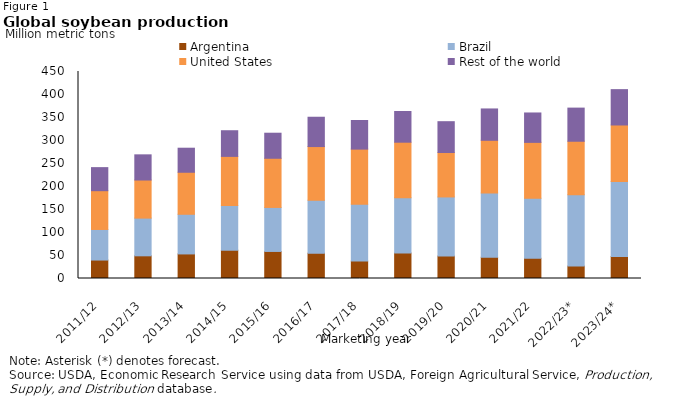
| Category | Argentina                      | Brazil                         | United States                  | Rest of the world |
|---|---|---|---|---|
| 2011/12 | 40.1 | 66.5 | 84.291 | 50.134 |
| 2012/13 | 49.3 | 82 | 82.791 | 54.732 |
| 2013/14 | 53.4 | 86.2 | 91.363 | 52.276 |
| 2014/15 | 61.45 | 97.1 | 106.905 | 55.793 |
| 2015/16 | 58.8 | 95.7 | 106.869 | 54.464 |
| 2016/17 | 55 | 114.9 | 116.931 | 63.727 |
| 2017/18 | 37.8 | 123.4 | 120.065 | 62.211 |
| 2018/19 | 55.3 | 120.5 | 120.515 | 66.7 |
| 2019/20 | 48.8 | 128.5 | 96.667 | 66.929 |
| 2020/21 | 46.2 | 139.5 | 114.749 | 68.147 |
| 2021/22 | 43.9 | 130.5 | 121.528 | 63.918 |
| 2022/23* | 27 | 155 | 116.377 | 72.044 |
| 2023/24* | 48 | 163 | 122.742 | 76.843 |